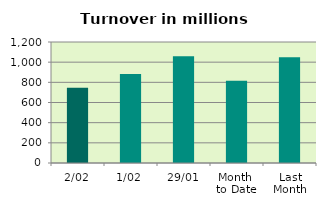
| Category | Series 0 |
|---|---|
| 2/02 | 747.284 |
| 1/02 | 882.231 |
| 29/01 | 1058.51 |
| Month 
to Date | 814.758 |
| Last
Month | 1049.647 |